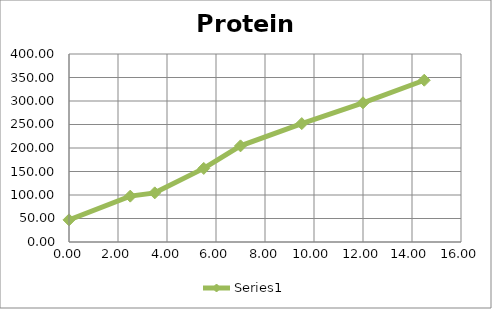
| Category | Series 0 |
|---|---|
| 0.0 | 47.104 |
| 2.5 | 97.564 |
| 3.5 | 104.564 |
| 5.5 | 156.564 |
| 7.0 | 204.544 |
| 9.5 | 251.904 |
| 12.0 | 296.204 |
| 14.5 | 344.204 |